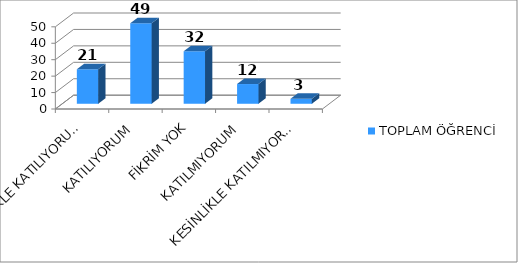
| Category | TOPLAM ÖĞRENCİ |
|---|---|
| KESİNLİKLE KATILIYORUM | 21 |
| KATILIYORUM | 49 |
| FİKRİM YOK | 32 |
| KATILMIYORUM | 12 |
| KESİNLİKLE KATILMIYORUM | 3 |